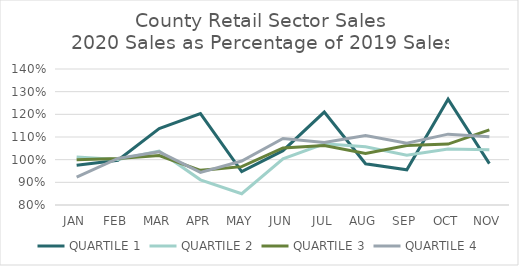
| Category | QUARTILE 1 | QUARTILE 2 | QUARTILE 3 | QUARTILE 4 |
|---|---|---|---|---|
| JAN | 0.975 | 1.012 | 1 | 0.923 |
| FEB | 0.998 | 1.001 | 1.005 | 1.005 |
| MAR | 1.137 | 1.037 | 1.018 | 1.034 |
| APR | 1.203 | 0.911 | 0.953 | 0.944 |
| MAY | 0.948 | 0.85 | 0.969 | 0.994 |
| JUN | 1.04 | 1.004 | 1.052 | 1.093 |
| JUL | 1.21 | 1.07 | 1.063 | 1.076 |
| AUG | 0.982 | 1.057 | 1.027 | 1.107 |
| SEP | 0.955 | 1.02 | 1.062 | 1.073 |
| OCT | 1.267 | 1.047 | 1.069 | 1.113 |
| NOV | 0.983 | 1.043 | 1.131 | 1.102 |